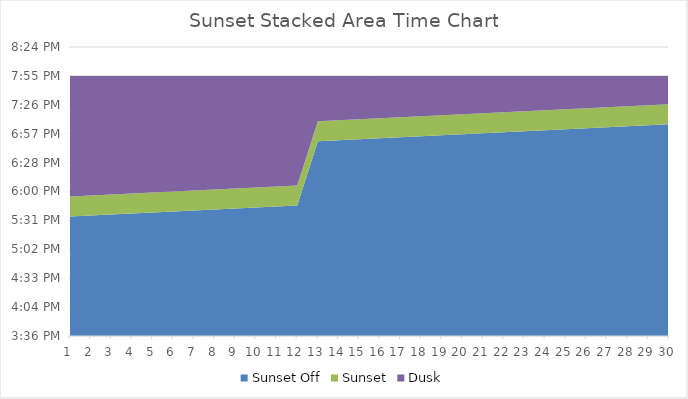
| Category | Sunset Off | Sunset | Dusk |
|---|---|---|---|
| 1.0 | 0.733 | 0.014 | 0.083 |
| 2.0 | 0.733 | 0.014 | 0.083 |
| 3.0 | 0.734 | 0.014 | 0.082 |
| 4.0 | 0.735 | 0.014 | 0.081 |
| 5.0 | 0.735 | 0.014 | 0.081 |
| 6.0 | 0.736 | 0.014 | 0.08 |
| 7.0 | 0.737 | 0.014 | 0.079 |
| 8.0 | 0.737 | 0.014 | 0.078 |
| 9.0 | 0.738 | 0.014 | 0.078 |
| 10.0 | 0.739 | 0.014 | 0.077 |
| 11.0 | 0.74 | 0.014 | 0.076 |
| 12.0 | 0.74 | 0.014 | 0.076 |
| 13.0 | 0.785 | 0.014 | 0.031 |
| 14.0 | 0.785 | 0.014 | 0.031 |
| 15.0 | 0.786 | 0.014 | 0.03 |
| 16.0 | 0.787 | 0.014 | 0.029 |
| 17.0 | 0.788 | 0.014 | 0.028 |
| 18.0 | 0.788 | 0.014 | 0.028 |
| 19.0 | 0.789 | 0.014 | 0.027 |
| 20.0 | 0.79 | 0.014 | 0.026 |
| 21.0 | 0.79 | 0.014 | 0.026 |
| 22.0 | 0.791 | 0.014 | 0.025 |
| 23.0 | 0.792 | 0.014 | 0.024 |
| 24.0 | 0.792 | 0.014 | 0.024 |
| 25.0 | 0.793 | 0.014 | 0.023 |
| 26.0 | 0.794 | 0.014 | 0.022 |
| 27.0 | 0.794 | 0.014 | 0.022 |
| 28.0 | 0.795 | 0.014 | 0.021 |
| 29.0 | 0.796 | 0.014 | 0.02 |
| 30.0 | 0.797 | 0.014 | 0.019 |